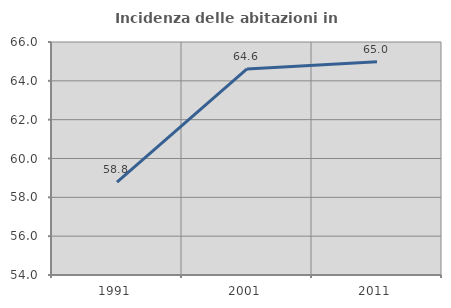
| Category | Incidenza delle abitazioni in proprietà  |
|---|---|
| 1991.0 | 58.785 |
| 2001.0 | 64.615 |
| 2011.0 | 64.981 |